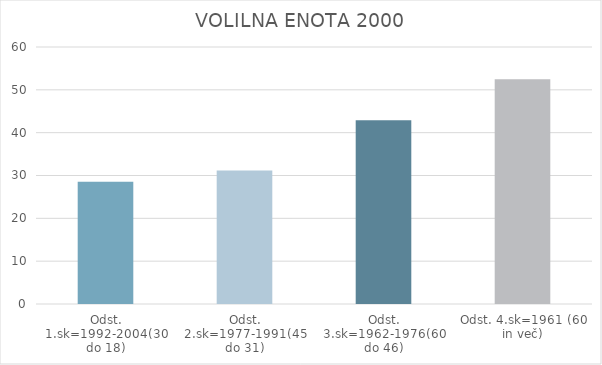
| Category | Series 0 |
|---|---|
| Odst. 1.sk=1992-2004(30 do 18) | 28.55 |
| Odst. 2.sk=1977-1991(45 do 31) | 31.15 |
| Odst. 3.sk=1962-1976(60 do 46) | 42.88 |
| Odst. 4.sk=1961 (60 in več) | 52.45 |